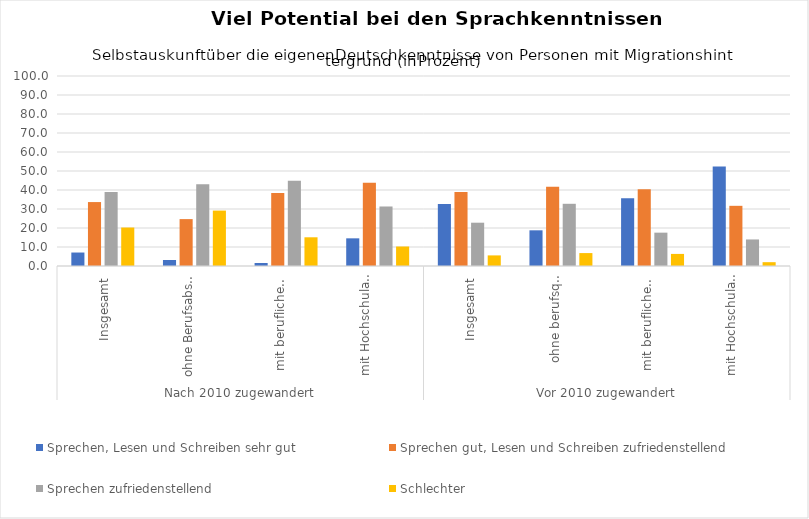
| Category | Sprechen, Lesen und Schreiben sehr gut | Sprechen gut, Lesen und Schreiben zufriedenstellend | Sprechen zufriedenstellend  | Schlechter |
|---|---|---|---|---|
| 0 | 7.09 | 33.65 | 39.01 | 20.25 |
| 1 | 3.15 | 24.68 | 43.01 | 29.16 |
| 2 | 1.58 | 38.39 | 44.91 | 15.11 |
| 3 | 14.56 | 43.87 | 31.32 | 10.26 |
| 4 | 32.64 | 39 | 22.79 | 5.58 |
| 5 | 18.78 | 41.68 | 32.74 | 6.8 |
| 6 | 35.66 | 40.42 | 17.55 | 6.36 |
| 7 | 52.35 | 31.67 | 13.97 | 2.01 |